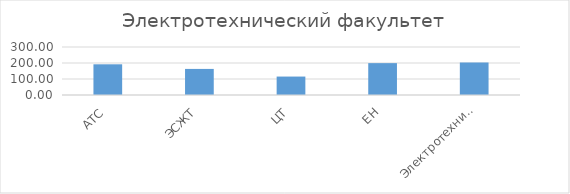
| Category | Series 0 |
|---|---|
| АТС | 191.857 |
| ЭСЖТ | 163 |
| ЦТ | 115.25 |
| ЕН | 199.167 |
| Электротехника | 203 |